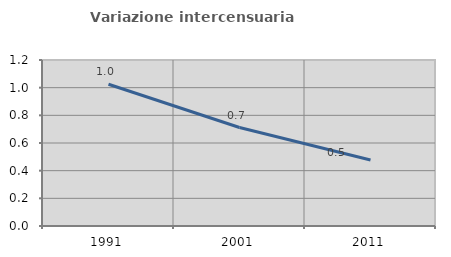
| Category | Variazione intercensuaria annua |
|---|---|
| 1991.0 | 1.025 |
| 2001.0 | 0.712 |
| 2011.0 | 0.478 |